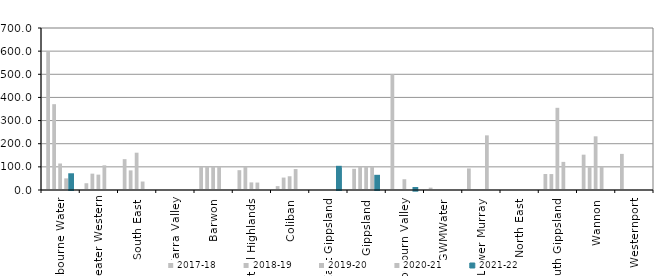
| Category | 2017-18 | 2018-19 | 2019-20 | 2020-21 | 2021-22 |
|---|---|---|---|---|---|
| Melbourne Water | 596.133 | 370.85 | 114.547 | 50.285 | 63.632 |
| Greater Western | 29.194 | 70.648 | 66.475 | 106.68 | 0 |
| South East | 133.23 | 84.751 | 161.14 | 36.579 | 0 |
| Yarra Valley | 0 | 0 | 0 | 0 | 0 |
| Barwon | 99.577 | 100 | 100 | 100 | 0 |
| Central Highlands | 85.645 | 100 | 32.821 | 32.138 | 0 |
| Coliban | 16.71 | 53.715 | 59.407 | 90.479 | 0 |
| East Gippsland | 0 | 0 | 0 | 0 | 95.878 |
| Gippsland | 91.564 | 100 | 100 | 100 | 57.009 |
| Goulburn Valley | 500 | 0 | 46.585 | 0 | 1.337 |
| GWMWater | 10.256 | 0 | 0 | 0 | 0 |
| Lower Murray | 93.21 | 0 | 0 | 236.118 | 0 |
| North East | 0 | 0 | 0 | 0 | 0 |
| South Gippsland | 69.022 | 68.939 | 355.15 | 121.429 | 0 |
| Wannon | 152.647 | 98.541 | 231.922 | 100.844 | 0 |
| Westernport | 155.988 | 0 | 0 | 0 | 0 |